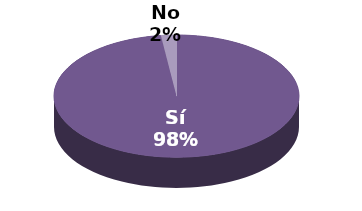
| Category | Series 1 |
|---|---|
| Sí | 48 |
| No | 1 |